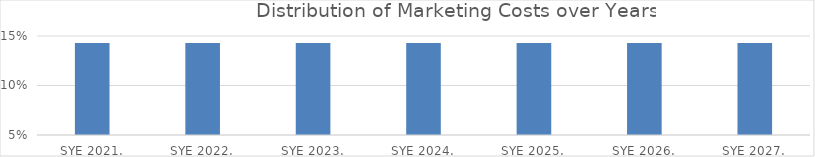
| Category | Series1 |
|---|---|
| SYE 2021 | 0.143 |
| SYE 2022 | 0.143 |
| SYE 2023 | 0.143 |
| SYE 2024 | 0.143 |
| SYE 2025 | 0.143 |
| SYE 2026 | 0.143 |
| SYE 2027 | 0.143 |